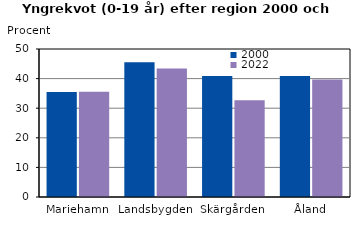
| Category | 2000 | 2022 |
|---|---|---|
| Mariehamn | 35.463 | 35.566 |
| Landsbygden | 45.524 | 43.422 |
| Skärgården | 40.92 | 32.649 |
| Åland | 40.872 | 39.709 |